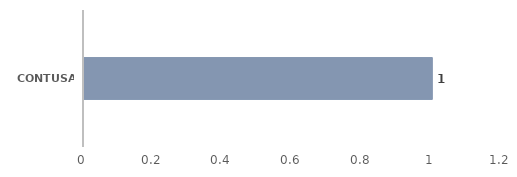
| Category | Total |
|---|---|
| CONTUSAO | 1 |